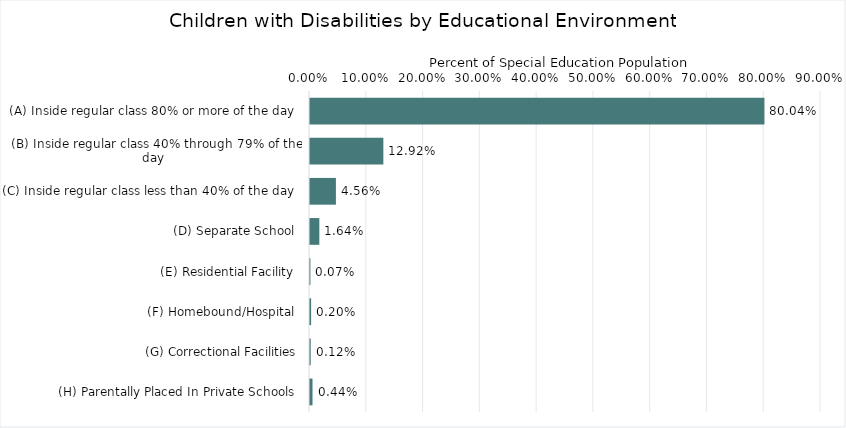
| Category | Percentage |
|---|---|
| (A) Inside regular class 80% or more of the day  | 0.8 |
| (B) Inside regular class 40% through 79% of the day  | 0.129 |
| (C) Inside regular class less than 40% of the day  | 0.046 |
| (D) Separate School  | 0.016 |
| (E) Residential Facility  | 0.001 |
| (F) Homebound/Hospital  | 0.002 |
| (G) Correctional Facilities | 0.001 |
| (H) Parentally Placed In Private Schools  | 0.004 |